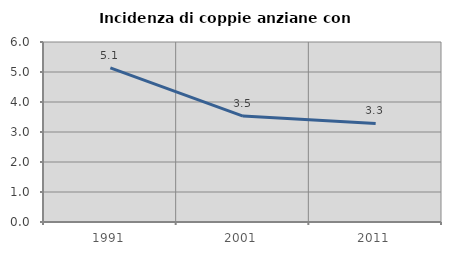
| Category | Incidenza di coppie anziane con figli |
|---|---|
| 1991.0 | 5.137 |
| 2001.0 | 3.529 |
| 2011.0 | 3.287 |